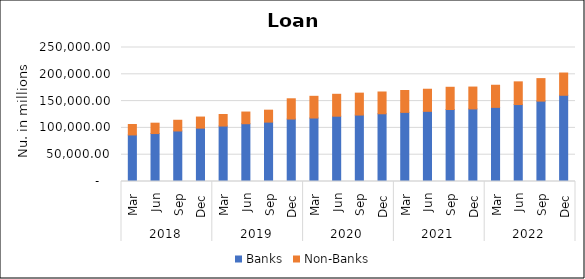
| Category | Banks | Non-Banks |
|---|---|---|
| 0 | 86839.062 | 19536.13 |
| 1 | 89492.789 | 19317.924 |
| 2 | 94257.106 | 19993.763 |
| 3 | 99542.627 | 20696.164 |
| 4 | 103455.022 | 21541.616 |
| 5 | 107823.786 | 21766.128 |
| 6 | 110793.514 | 22289.762 |
| 7 | 116541.685 | 37784.488 |
| 8 | 118433.441 | 40493.857 |
| 9 | 121831.338 | 40869.086 |
| 10 | 123947.936 | 40898.135 |
| 11 | 126363.799 | 40625.692 |
| 12 | 128951.639 | 40851.287 |
| 13 | 130897.833 | 41243.55 |
| 14 | 134359.87 | 41428.68 |
| 15 | 135415.887 | 40793.4 |
| 16 | 138284.661 | 41288.566 |
| 17 | 143532.338 | 42375.24 |
| 18 | 149966.968 | 41992.436 |
| 19 | 160873.72 | 41509.575 |